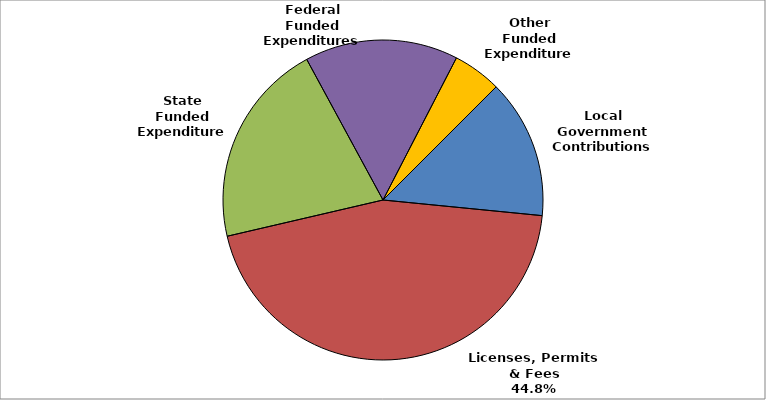
| Category | Series 0 |
|---|---|
| Local Government Contributions | 0.141 |
| Licenses, Permits & Fees | 0.448 |
| State Funded Expenditures | 0.207 |
| Federal Funded Expenditures | 0.155 |
| Other Funded Expenditures | 0.049 |